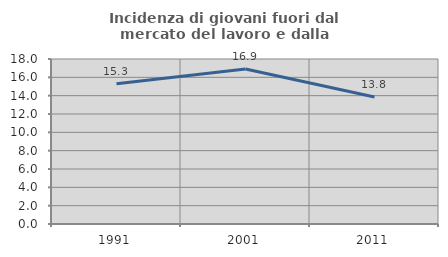
| Category | Incidenza di giovani fuori dal mercato del lavoro e dalla formazione  |
|---|---|
| 1991.0 | 15.297 |
| 2001.0 | 16.91 |
| 2011.0 | 13.846 |